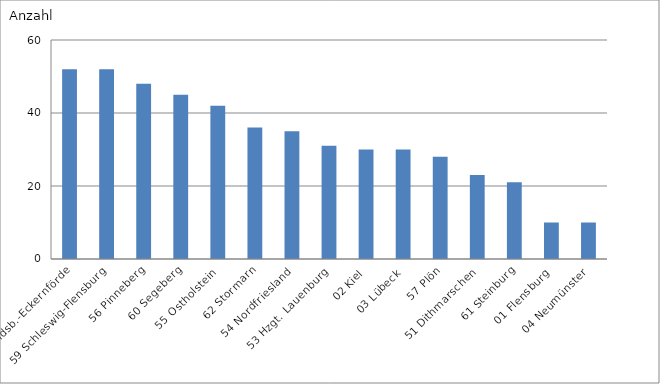
| Category | 58 Rendsb.-Eckernförde |
|---|---|
| 58 Rendsb.-Eckernförde | 52 |
| 59 Schleswig-Flensburg | 52 |
| 56 Pinneberg | 48 |
| 60 Segeberg | 45 |
| 55 Ostholstein | 42 |
| 62 Stormarn | 36 |
| 54 Nordfriesland | 35 |
| 53 Hzgt. Lauenburg | 31 |
| 02 Kiel | 30 |
| 03 Lübeck | 30 |
| 57 Plön | 28 |
| 51 Dithmarschen | 23 |
| 61 Steinburg | 21 |
| 01 Flensburg | 10 |
| 04 Neumünster | 10 |